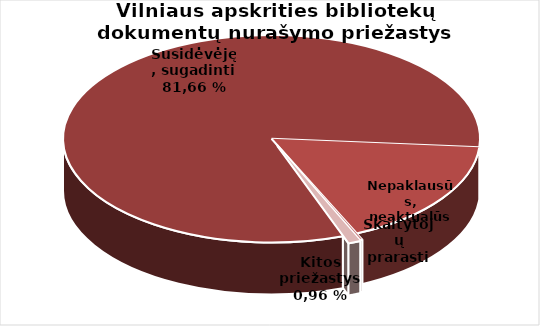
| Category | Series 0 |
|---|---|
| Susidėvėję, | 92353 |
| Nepaklausūs, | 19143 |
| Skaitytojų  | 210 |
| Kt. | 1091 |